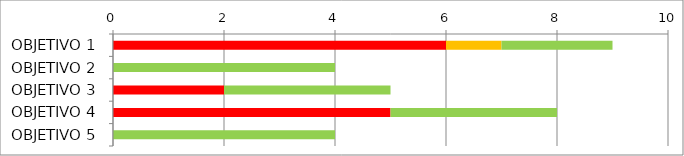
| Category | Series 0 | Series 1 | Series 2 | Series 3 | Series 4 | Series 5 |
|---|---|---|---|---|---|---|
| OBJETIVO 1 | 0 | 0 | 6 | 1 | 2 | 0 |
| OBJETIVO 2 | 0 | 0 | 0 | 0 | 4 | 0 |
| OBJETIVO 3 | 0 | 0 | 2 | 0 | 3 | 0 |
| OBJETIVO 4 | 0 | 0 | 5 | 0 | 3 | 0 |
| OBJETIVO 5 | 0 | 0 | 0 | 0 | 4 | 0 |